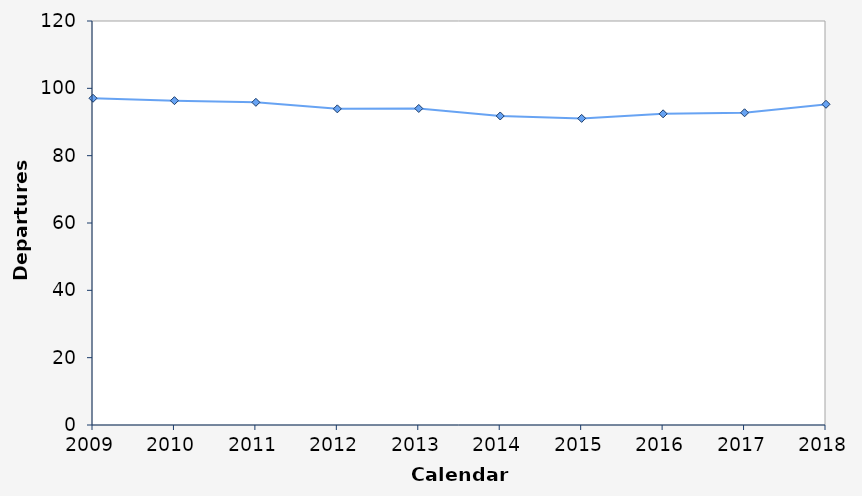
| Category | Departures (100,000s) |
|---|---|
| 2009.0 | 97.051 |
| 2010.0 | 96.338 |
| 2011.0 | 95.839 |
| 2012.0 | 93.907 |
| 2013.0 | 94.019 |
| 2014.0 | 91.787 |
| 2015.0 | 91.072 |
| 2016.0 | 92.43 |
| 2017.0 | 92.742 |
| 2018.0 | 95.261 |